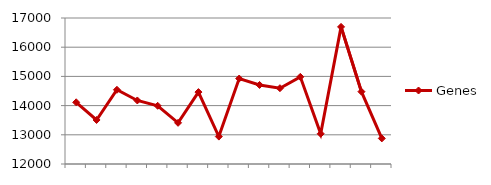
| Category | Genes |
|---|---|
|  | 14113 |
|  | 13507 |
|  | 14542 |
|  | 14176 |
|  | 13993 |
|  | 13410 |
|  | 14463 |
|  | 12940 |
|  | 14926 |
|  | 14707 |
|  | 14596 |
|  | 14985 |
|  | 13035 |
|  | 16696 |
|  | 14477 |
|  | 12876 |